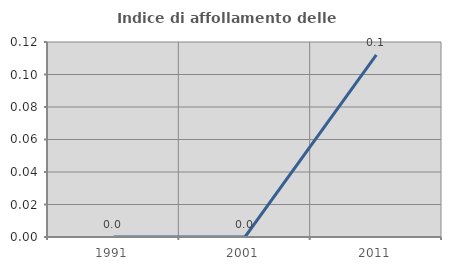
| Category | Indice di affollamento delle abitazioni  |
|---|---|
| 1991.0 | 0 |
| 2001.0 | 0 |
| 2011.0 | 0.112 |